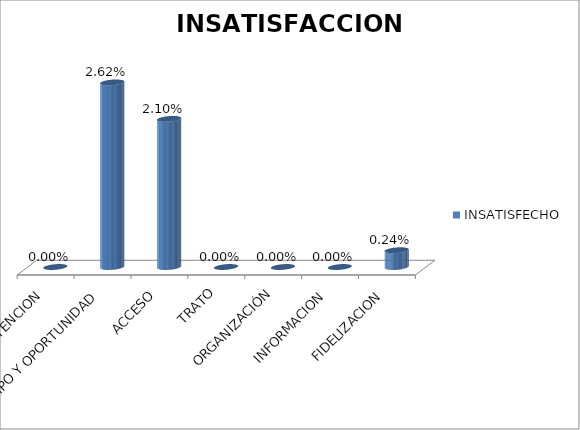
| Category | INSATISFECHO |
|---|---|
| ATENCION | 0 |
| TIEMPO Y OPORTUNIDAD | 0.026 |
| ACCESO | 0.021 |
| TRATO | 0 |
| ORGANIZACIÓN | 0 |
| INFORMACION | 0 |
| FIDELIZACION | 0.002 |